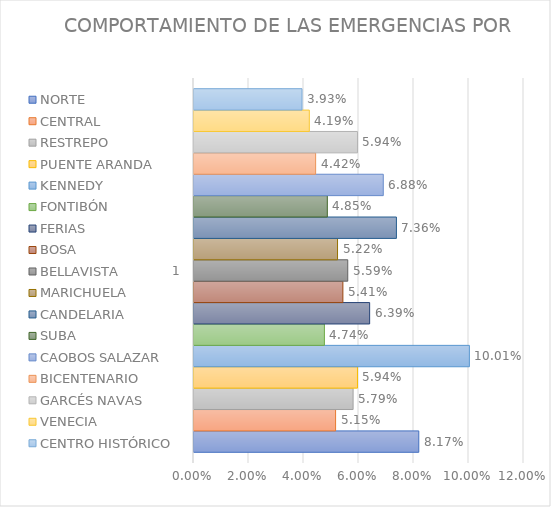
| Category | NORTE | CENTRAL | RESTREPO | PUENTE ARANDA | KENNEDY | FONTIBÓN | FERIAS | BOSA | BELLAVISTA | MARICHUELA | CANDELARIA | SUBA | CAOBOS SALAZAR | BICENTENARIO | GARCÉS NAVAS | VENECIA | CENTRO HISTÓRICO |
|---|---|---|---|---|---|---|---|---|---|---|---|---|---|---|---|---|---|
| 0 | 0.082 | 0.051 | 0.058 | 0.059 | 0.1 | 0.047 | 0.064 | 0.054 | 0.056 | 0.052 | 0.074 | 0.048 | 0.069 | 0.044 | 0.059 | 0.042 | 0.039 |